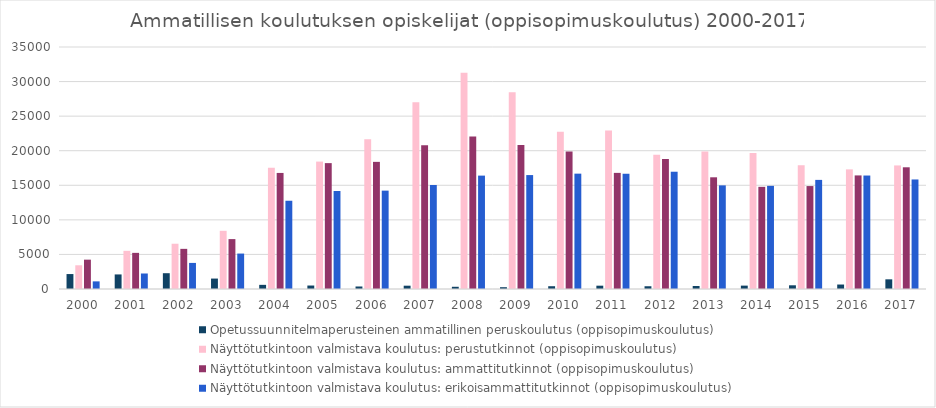
| Category | Opetussuunnitelmaperusteinen ammatillinen peruskoulutus (oppisopimuskoulutus) | Näyttötutkintoon valmistava koulutus: perustutkinnot (oppisopimuskoulutus) | Näyttötutkintoon valmistava koulutus: ammattitutkinnot (oppisopimuskoulutus) | Näyttötutkintoon valmistava koulutus: erikoisammattitutkinnot (oppisopimuskoulutus) |
|---|---|---|---|---|
| 2000 | 2162 | 3431 | 4244 | 1103 |
| 2001 | 2107 | 5520 | 5226 | 2243 |
| 2002 | 2285 | 6547 | 5806 | 3772 |
| 2003 | 1509 | 8415 | 7217 | 5124 |
| 2004 | 601 | 17535 | 16785 | 12764 |
| 2005 | 502 | 18427 | 18206 | 14172 |
| 2006 | 363 | 21654 | 18388 | 14227 |
| 2007 | 479 | 26996 | 20779 | 15041 |
| 2008 | 322 | 31274 | 22042 | 16399 |
| 2009 | 259 | 28450 | 20811 | 16477 |
| 2010 | 403 | 22741 | 19875 | 16683 |
| 2011 | 480 | 22934 | 16794 | 16668 |
| 2012 | 399 | 19407 | 18787 | 16961 |
| 2013 | 437 | 19885 | 16155 | 14989 |
| 2014 | 489 | 19672 | 14776 | 14919 |
| 2015 | 536 | 17899 | 14887 | 15780 |
| 2016 | 647 | 17303 | 16427 | 16411 |
| 2017 | 1399 | 17871 | 17603 | 15842 |